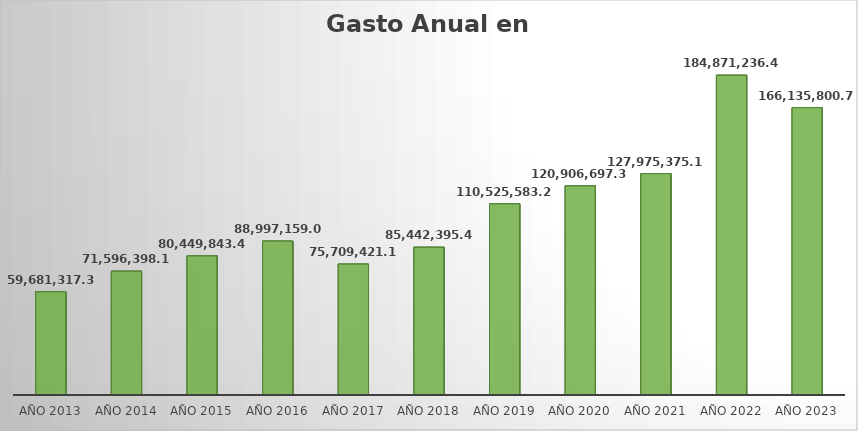
| Category | Monto |
|---|---|
| AÑO 2013 | 59681317.37 |
| AÑO 2014 | 71596398.17 |
| AÑO 2015 | 80449843.45 |
| AÑO 2016 | 88997159 |
| AÑO 2017 | 75709421.15 |
| AÑO 2018 | 85442395.49 |
| AÑO 2019 | 110525583.23 |
| AÑO 2020 | 120906697.31 |
| AÑO 2021 | 127975375.17 |
| AÑO 2022 | 184871236.47 |
| AÑO 2023 | 166135800.71 |